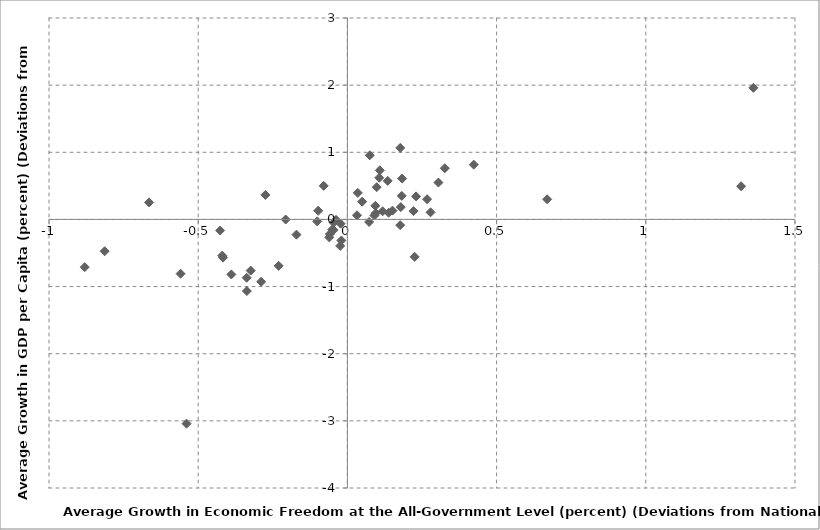
| Category | Series 0 |
|---|---|
| -0.41687223695558845 | -0.569 |
| -0.3369370765146253 | -1.067 |
| -0.8136011375828922 | -0.474 |
| 1.3193314676627343 | 0.494 |
| 1.3605579713827947 | 1.96 |
| 0.6693725504699972 | 0.3 |
| -0.8802215596568784 | -0.711 |
| -0.6645882325812065 | 0.254 |
| -0.4192719683537616 | -0.539 |
| 0.18223022212942447 | 0.351 |
| -0.03813596103805711 | -0.005 |
| -0.539004761497323 | -3.042 |
| -0.060574299639616636 | -0.267 |
| -0.20671243075699985 | -0.001 |
| -0.0462604159860768 | -0.158 |
| -0.02276924027153921 | -0.063 |
| 0.07485449995513872 | 0.955 |
| 0.17717853838240244 | 1.065 |
| 0.1383800544829625 | 0.1 |
| 0.1511148700730004 | 0.131 |
| -0.1708159387662689 | -0.227 |
| -0.020292246039509826 | -0.314 |
| 0.11795434193240502 | 0.121 |
| 0.09470618509710288 | 0.093 |
| 0.09050923767718434 | 0.058 |
| -0.058665175797916344 | -0.218 |
| -0.42652168433670523 | -0.165 |
| -0.33755990570799244 | -0.869 |
| 0.03489782632319343 | 0.395 |
| 0.3050604793322918 | 0.549 |
| 0.10864473849631698 | 0.731 |
| -0.024128883942696553 | -0.395 |
| 0.049412433848716394 | 0.265 |
| -0.046239692198275006 | -0.048 |
| 0.07271702534333552 | -0.038 |
| -0.3241424552965275 | -0.762 |
| 0.09362629254119027 | 0.202 |
| 0.22508869032273607 | -0.557 |
| 0.13501805880762008 | 0.574 |
| 0.10663672185721347 | 0.62 |
| -0.5590364667922129 | -0.808 |
| 0.09835620718304837 | 0.481 |
| -0.07941801292409871 | 0.5 |
| -0.10122277085910618 | -0.029 |
| -0.05063573630309194 | -0.151 |
| -0.2889228980323144 | -0.928 |
| 0.23018279681451043 | 0.343 |
| 0.26694591289485164 | 0.301 |
| 0.18352265830584172 | 0.609 |
| -0.09786251838571347 | 0.129 |
| 0.4234731121487336 | 0.816 |
| 0.17893085183636825 | 0.184 |
| -0.23032730078433392 | -0.691 |
| 0.2786662270216383 | 0.106 |
| -0.2747824361177521 | 0.365 |
| 0.3263958925959905 | 0.763 |
| 0.22157810963208446 | 0.124 |
| 0.17689586558153414 | -0.085 |
| 0.03218490560319533 | 0.062 |
| -0.3889013026164811 | -0.819 |